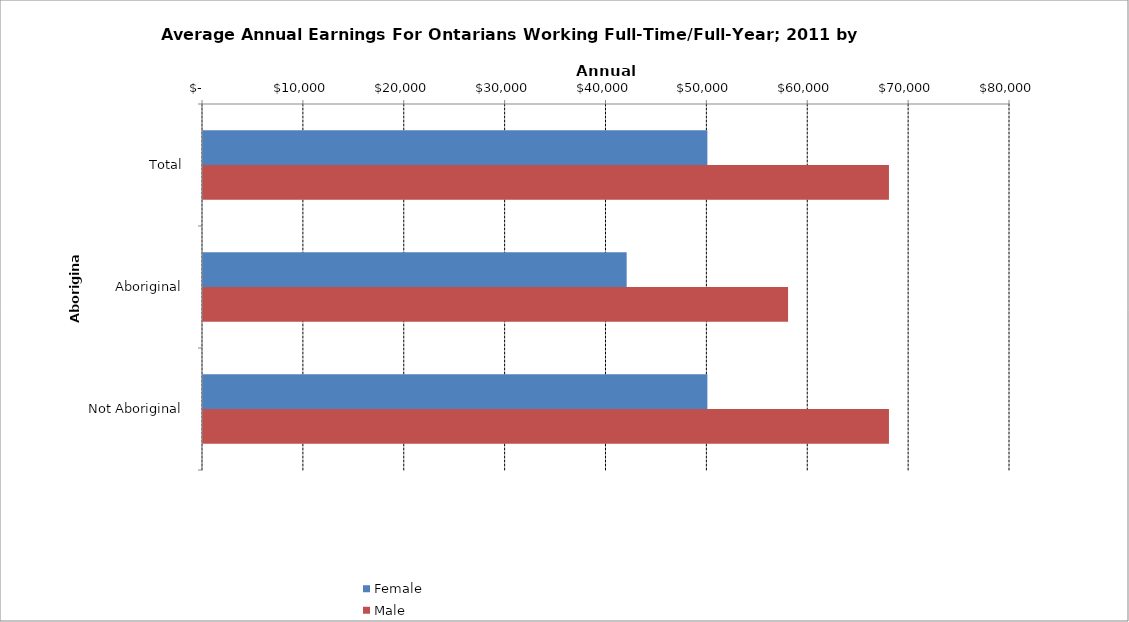
| Category | Female | Male |
|---|---|---|
| Total | 50000 | 68000 |
|  Aboriginal  | 42000 | 58000 |
|  Not Aboriginal  | 50000 | 68000 |